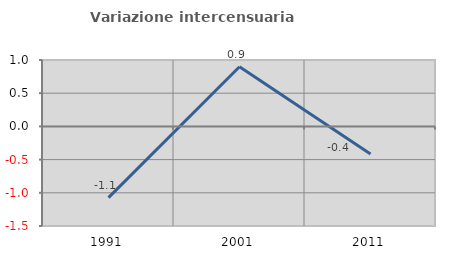
| Category | Variazione intercensuaria annua |
|---|---|
| 1991.0 | -1.072 |
| 2001.0 | 0.898 |
| 2011.0 | -0.417 |